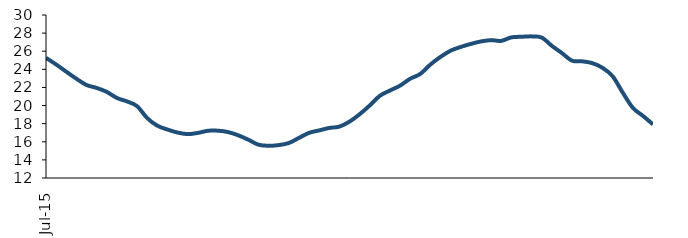
| Category | Series 0 |
|---|---|
| 2015-07-01 | 25.268 |
| 2015-08-01 | 24.538 |
| 2015-09-01 | 23.742 |
| 2015-10-01 | 22.965 |
| 2015-11-01 | 22.271 |
| 2015-12-01 | 21.949 |
| 2016-01-01 | 21.513 |
| 2016-02-01 | 20.844 |
| 2016-03-01 | 20.459 |
| 2016-04-01 | 19.934 |
| 2016-05-01 | 18.618 |
| 2016-06-01 | 17.778 |
| 2016-07-01 | 17.352 |
| 2016-08-01 | 17.019 |
| 2016-09-01 | 16.849 |
| 2016-10-01 | 16.975 |
| 2016-11-01 | 17.212 |
| 2016-12-01 | 17.225 |
| 2017-01-01 | 17.072 |
| 2017-02-01 | 16.714 |
| 2017-03-01 | 16.228 |
| 2017-04-01 | 15.677 |
| 2017-05-01 | 15.559 |
| 2017-06-01 | 15.632 |
| 2017-07-01 | 15.863 |
| 2017-08-01 | 16.424 |
| 2017-09-01 | 16.985 |
| 2017-10-01 | 17.256 |
| 2017-11-01 | 17.527 |
| 2017-12-01 | 17.674 |
| 2018-01-01 | 18.226 |
| 2018-02-01 | 19.041 |
| 2018-03-01 | 20.012 |
| 2018-04-01 | 21.075 |
| 2018-05-01 | 21.662 |
| 2018-06-01 | 22.202 |
| 2018-07-01 | 22.964 |
| 2018-08-01 | 23.494 |
| 2018-09-01 | 24.532 |
| 2018-10-01 | 25.379 |
| 2018-11-01 | 26.061 |
| 2018-12-01 | 26.476 |
| 2019-01-01 | 26.81 |
| 2019-02-01 | 27.08 |
| 2019-03-01 | 27.222 |
| 2019-04-01 | 27.143 |
| 2019-05-01 | 27.528 |
| 2019-06-01 | 27.596 |
| 2019-07-01 | 27.639 |
| 2019-08-01 | 27.508 |
| 2019-09-01 | 26.594 |
| 2019-10-01 | 25.793 |
| 2019-11-01 | 24.956 |
| 2019-12-01 | 24.882 |
| 2020-01-01 | 24.685 |
| 2020-02-01 | 24.173 |
| 2020-03-01 | 23.249 |
| 2020-04-01 | 21.444 |
| 2020-05-01 | 19.761 |
| 2020-06-01 | 18.865 |
| 2020-07-01 | 17.917 |